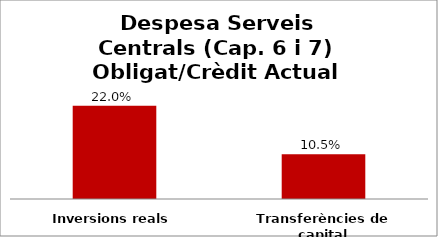
| Category | Series 0 |
|---|---|
| Inversions reals | 0.22 |
| Transferències de capital | 0.105 |